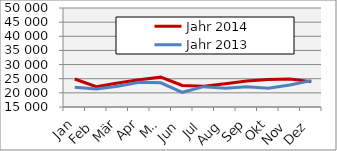
| Category | Jahr 2014 | Jahr 2013 |
|---|---|---|
| Jan | 24904.234 | 21986.048 |
| Feb | 22181.267 | 21357.718 |
| Mär | 23502.939 | 22324.545 |
| Apr | 24644.186 | 23736.902 |
| Mai | 25555.948 | 23561.069 |
| Jun | 22605.013 | 20195.258 |
| Jul | 22341.602 | 22194.298 |
| Aug | 23221.382 | 21594.502 |
| Sep | 24172.032 | 22140.544 |
| Okt | 24708.102 | 21617.195 |
| Nov | 24895.857 | 22785.135 |
| Dez | 23967.278 | 24326.86 |